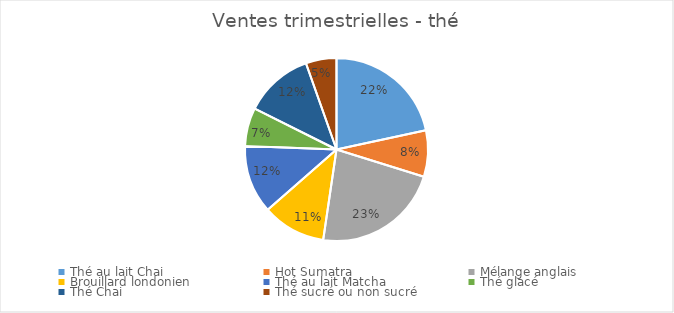
| Category | Ventes trimestrielles |
|---|---|
| Thé au lait Chai | 8170 |
| Hot Sumatra | 3100 |
| Mélange anglais | 8510 |
| Brouillard londonien | 4243.2 |
| Thé au lait Matcha | 4562.5 |
| Thé glacé  | 2554.5 |
| Thé Chai | 4612.5 |
| Thé sucré ou non sucré | 2047.5 |